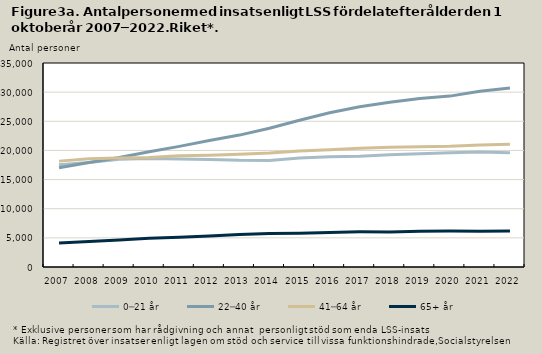
| Category | 0─21 år | 22─40 år | 41─64 år | 65+ år |
|---|---|---|---|---|
| 2007.0 | 17529 | 17040 | 18165 | 4127 |
| 2008.0 | 17927 | 17939 | 18564 | 4395 |
| 2009.0 | 18495 | 18776 | 18698 | 4619 |
| 2010.0 | 18612 | 19757 | 18808 | 4919 |
| 2011.0 | 18537 | 20697 | 19066 | 5105 |
| 2012.0 | 18460 | 21701 | 19185 | 5309 |
| 2013.0 | 18296 | 22632 | 19346 | 5570 |
| 2014.0 | 18280 | 23819 | 19555 | 5743 |
| 2015.0 | 18684 | 25172 | 19889 | 5796 |
| 2016.0 | 18913 | 26471 | 20118 | 5930 |
| 2017.0 | 19006 | 27505 | 20369 | 6032 |
| 2018.0 | 19261 | 28254 | 20548 | 6024 |
| 2019.0 | 19433 | 28897 | 20638 | 6119 |
| 2020.0 | 19619 | 29319 | 20700 | 6163 |
| 2021.0 | 19724 | 30167 | 20924 | 6152 |
| 2022.0 | 19597 | 30710 | 21080 | 6159 |